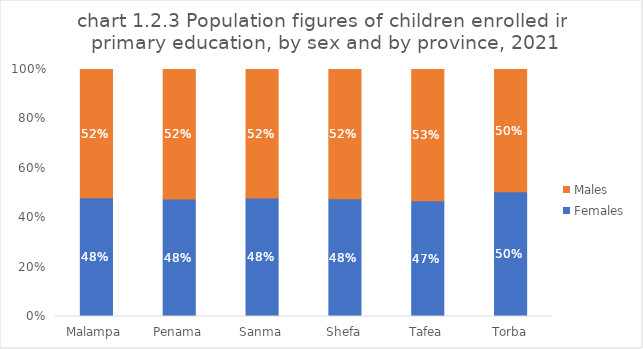
| Category | Females | Males |
|---|---|---|
| Malampa | 0.481 | 0.519 |
| Penama | 0.476 | 0.524 |
| Sanma | 0.48 | 0.52 |
| Shefa | 0.477 | 0.523 |
| Tafea | 0.469 | 0.531 |
| Torba | 0.505 | 0.495 |